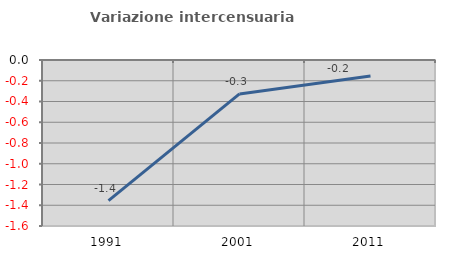
| Category | Variazione intercensuaria annua |
|---|---|
| 1991.0 | -1.356 |
| 2001.0 | -0.327 |
| 2011.0 | -0.154 |